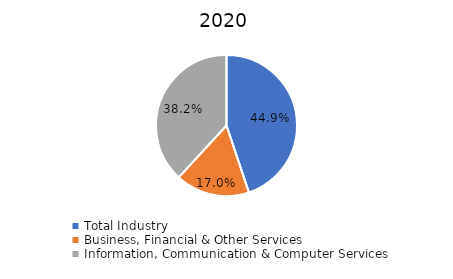
| Category | Series 0 |
|---|---|
| Total Industry | 0.449 |
| Business, Financial & Other Services | 0.17 |
| Information, Communication & Computer Services | 0.382 |